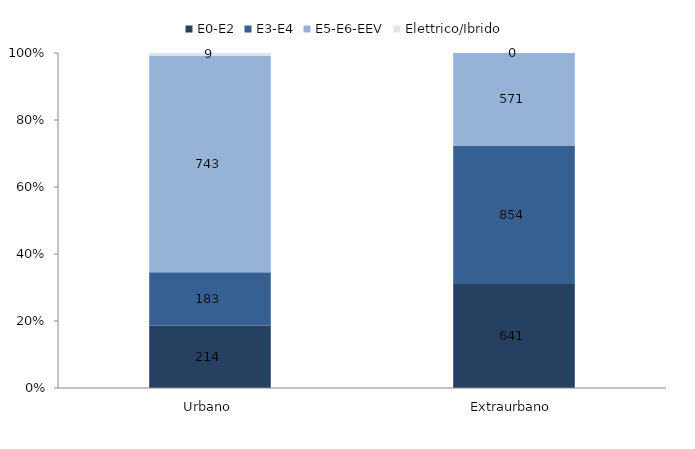
| Category | E0-E2 | E3-E4 | E5-E6-EEV | Elettrico/Ibrido |
|---|---|---|---|---|
| Urbano | 214 | 183 | 743 | 9 |
| Extraurbano | 641 | 854 | 571 | 0 |